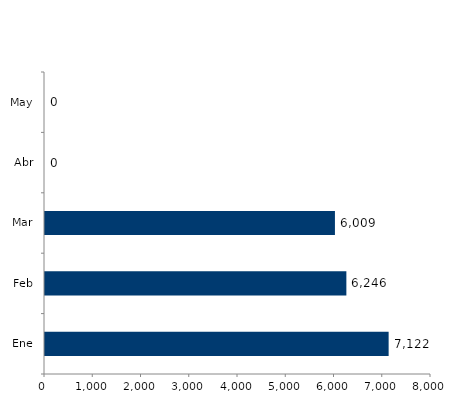
| Category | Series 0 |
|---|---|
| Ene | 7122 |
| Feb | 6246 |
| Mar | 6009 |
| Abr | 0 |
| May | 0 |